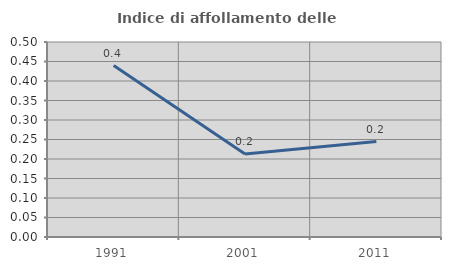
| Category | Indice di affollamento delle abitazioni  |
|---|---|
| 1991.0 | 0.439 |
| 2001.0 | 0.213 |
| 2011.0 | 0.245 |